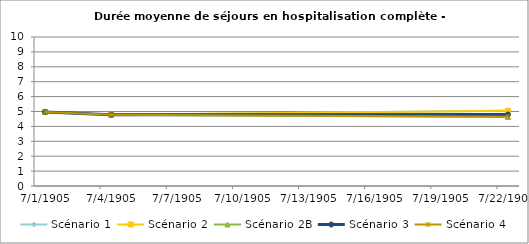
| Category | Scénario 1 | Scénario 2 | Scénario 2B | Scénario 3 | Scénario 4 |
|---|---|---|---|---|---|
| 2009.0 | 4.974 | 4.974 | 4.974 | 4.974 | 4.974 |
| 2012.0 | 4.783 | 4.783 | 4.783 | 4.783 | 4.783 |
| 2030.0 | 5.055 | 5.047 | 4.638 | 4.795 | 4.65 |